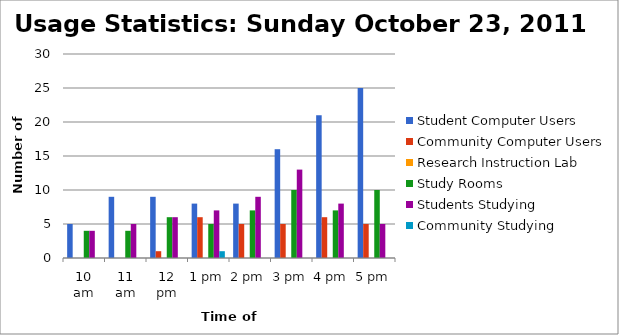
| Category | Student Computer Users | Community Computer Users | Research Instruction Lab | Study Rooms | Students Studying | Community Studying |
|---|---|---|---|---|---|---|
| 10 am | 5 | 0 | 0 | 4 | 4 | 0 |
| 11 am | 9 | 0 | 0 | 4 | 5 | 0 |
| 12 pm | 9 | 1 | 0 | 6 | 6 | 0 |
| 1 pm | 8 | 6 | 0 | 5 | 7 | 1 |
| 2 pm | 8 | 5 | 0 | 7 | 9 | 0 |
| 3 pm | 16 | 5 | 0 | 10 | 13 | 0 |
| 4 pm | 21 | 6 | 0 | 7 | 8 | 0 |
| 5 pm | 25 | 5 | 0 | 10 | 5 | 0 |